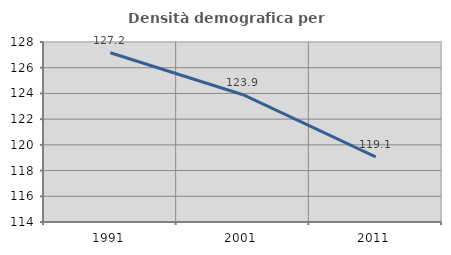
| Category | Densità demografica |
|---|---|
| 1991.0 | 127.163 |
| 2001.0 | 123.899 |
| 2011.0 | 119.069 |